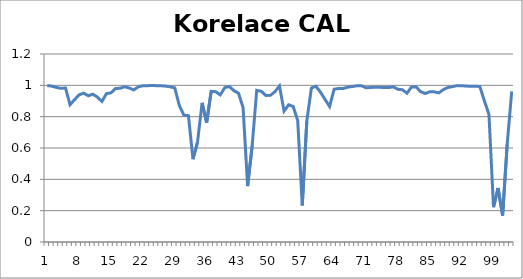
| Category | Korelace CAL 16 |
|---|---|
| 0 | 0.999 |
| 1 | 0.995 |
| 2 | 0.987 |
| 3 | 0.981 |
| 4 | 0.983 |
| 5 | 0.876 |
| 6 | 0.909 |
| 7 | 0.94 |
| 8 | 0.95 |
| 9 | 0.933 |
| 10 | 0.943 |
| 11 | 0.925 |
| 12 | 0.897 |
| 13 | 0.947 |
| 14 | 0.952 |
| 15 | 0.98 |
| 16 | 0.981 |
| 17 | 0.991 |
| 18 | 0.983 |
| 19 | 0.971 |
| 20 | 0.991 |
| 21 | 0.997 |
| 22 | 0.998 |
| 23 | 0.999 |
| 24 | 0.998 |
| 25 | 0.997 |
| 26 | 0.995 |
| 27 | 0.99 |
| 28 | 0.984 |
| 29 | 0.871 |
| 30 | 0.81 |
| 31 | 0.806 |
| 32 | 0.529 |
| 33 | 0.638 |
| 34 | 0.888 |
| 35 | 0.762 |
| 36 | 0.962 |
| 37 | 0.96 |
| 38 | 0.939 |
| 39 | 0.986 |
| 40 | 0.992 |
| 41 | 0.966 |
| 42 | 0.949 |
| 43 | 0.858 |
| 44 | 0.356 |
| 45 | 0.615 |
| 46 | 0.969 |
| 47 | 0.962 |
| 48 | 0.935 |
| 49 | 0.936 |
| 50 | 0.96 |
| 51 | 0.996 |
| 52 | 0.836 |
| 53 | 0.876 |
| 54 | 0.865 |
| 55 | 0.775 |
| 56 | 0.233 |
| 57 | 0.773 |
| 58 | 0.983 |
| 59 | 0.994 |
| 60 | 0.956 |
| 61 | 0.91 |
| 62 | 0.865 |
| 63 | 0.975 |
| 64 | 0.98 |
| 65 | 0.98 |
| 66 | 0.988 |
| 67 | 0.993 |
| 68 | 0.997 |
| 69 | 0.998 |
| 70 | 0.984 |
| 71 | 0.986 |
| 72 | 0.989 |
| 73 | 0.987 |
| 74 | 0.986 |
| 75 | 0.986 |
| 76 | 0.99 |
| 77 | 0.975 |
| 78 | 0.972 |
| 79 | 0.95 |
| 80 | 0.99 |
| 81 | 0.99 |
| 82 | 0.96 |
| 83 | 0.948 |
| 84 | 0.959 |
| 85 | 0.958 |
| 86 | 0.952 |
| 87 | 0.973 |
| 88 | 0.986 |
| 89 | 0.992 |
| 90 | 0.998 |
| 91 | 0.997 |
| 92 | 0.995 |
| 93 | 0.994 |
| 94 | 0.995 |
| 95 | 0.992 |
| 96 | 0.9 |
| 97 | 0.814 |
| 98 | 0.222 |
| 99 | 0.345 |
| 100 | 0.168 |
| 101 | 0.623 |
| 102 | 0.961 |